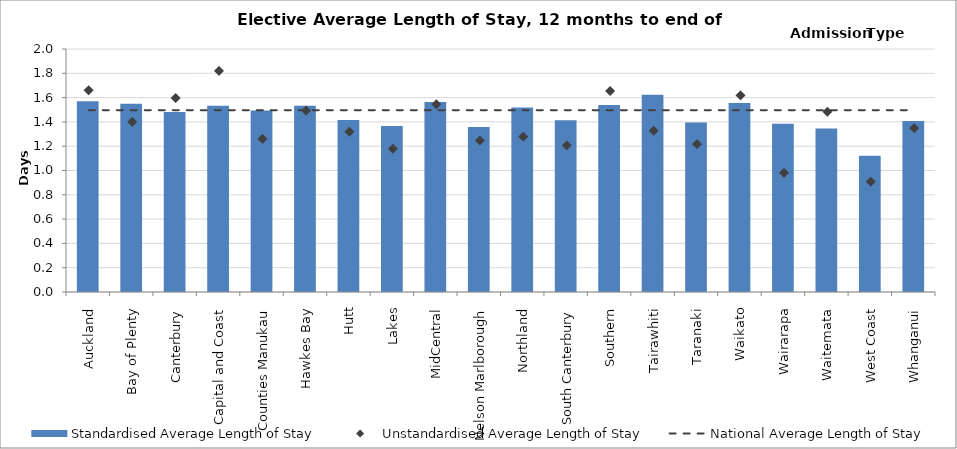
| Category | Standardised Average Length of Stay |
|---|---|
| Auckland | 1.571 |
| Bay of Plenty | 1.549 |
| Canterbury | 1.481 |
| Capital and Coast | 1.533 |
| Counties Manukau | 1.493 |
| Hawkes Bay | 1.534 |
| Hutt | 1.416 |
| Lakes | 1.366 |
| MidCentral | 1.563 |
| Nelson Marlborough | 1.357 |
| Northland | 1.519 |
| South Canterbury | 1.414 |
| Southern | 1.539 |
| Tairawhiti | 1.623 |
| Taranaki | 1.395 |
| Waikato | 1.555 |
| Wairarapa | 1.384 |
| Waitemata | 1.345 |
| West Coast | 1.122 |
| Whanganui | 1.407 |